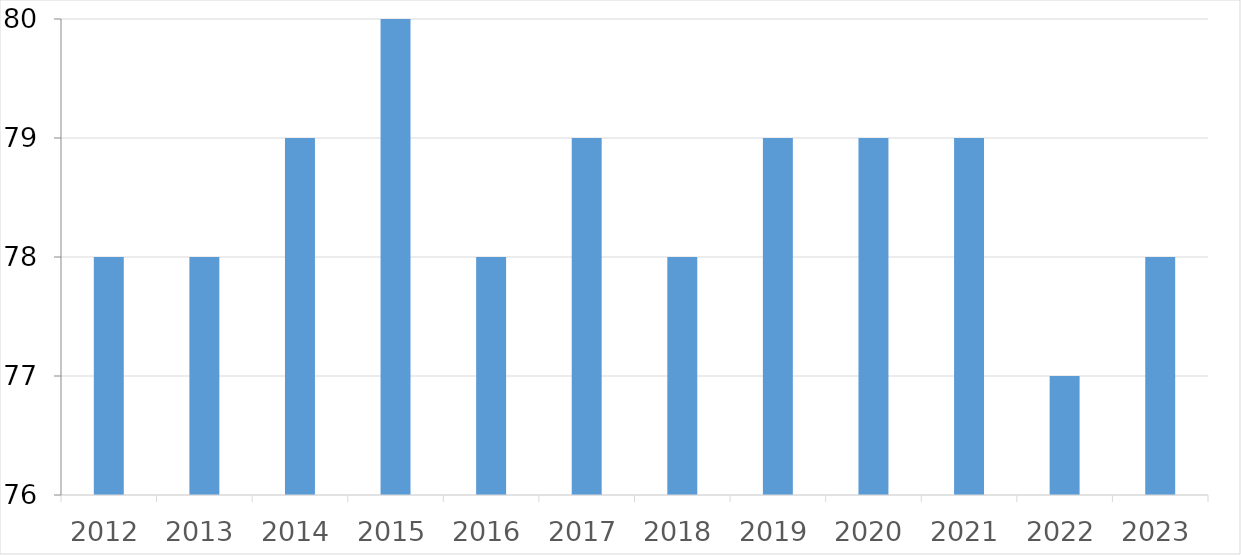
| Category | Series 0 |
|---|---|
| 2012 | 78 |
| 2013 | 78 |
| 2014 | 79 |
| 2015 | 80 |
| 2016 | 78 |
| 2017 | 79 |
| 2018 | 78 |
| 2019 | 79 |
| 2020 | 79 |
| 2021 | 79 |
| 2022 | 77 |
| 2023 | 78 |